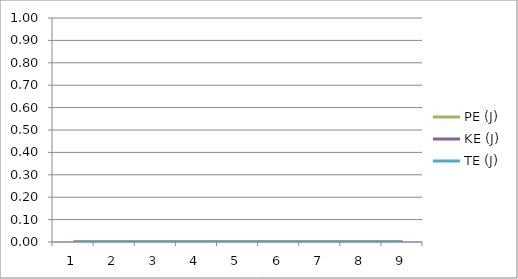
| Category | PE (J) | KE (J) | TE (J) |
|---|---|---|---|
| 0 | 0 | 0 | 0 |
| 1 | 0 | 0 | 0 |
| 2 | 0 | 0 | 0 |
| 3 | 0 | 0 | 0 |
| 4 | 0 | 0 | 0 |
| 5 | 0 | 0 | 0 |
| 6 | 0 | 0 | 0 |
| 7 | 0 | 0 | 0 |
| 8 | 0 | 0 | 0 |